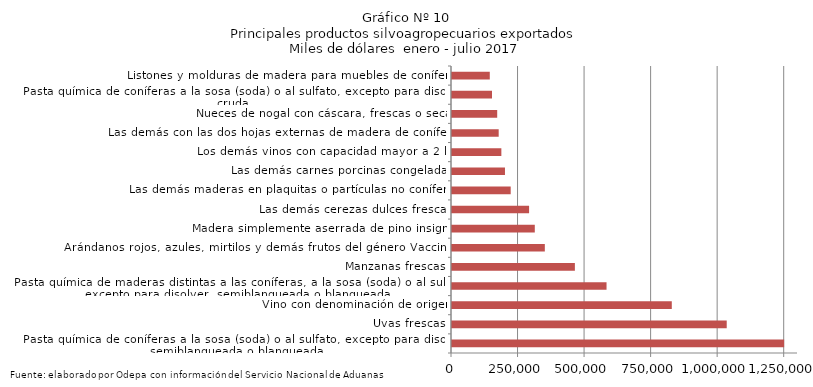
| Category | Series 0 |
|---|---|
| Pasta química de coníferas a la sosa (soda) o al sulfato, excepto para disolver, semiblanqueada o blanqueada | 1247924.648 |
| Uvas frescas | 1032195.708 |
| Vino con denominación de origen | 825824.941 |
| Pasta química de maderas distintas a las coníferas, a la sosa (soda) o al sulfato, excepto para disolver, semiblanqueada o blanqueada | 580644.315 |
| Manzanas frescas | 461706.92 |
| Arándanos rojos, azules, mirtilos y demás frutos del género Vaccinium | 348776.936 |
| Madera simplemente aserrada de pino insigne | 311083.835 |
| Las demás cerezas dulces frescas | 289633.785 |
| Las demás maderas en plaquitas o partículas no coníferas | 220536.906 |
| Las demás carnes porcinas congeladas | 199035.314 |
| Los demás vinos con capacidad mayor a 2 lts | 185440.667 |
| Las demás con las dos hojas externas de madera de coníferas | 175417.888 |
| Nueces de nogal con cáscara, frescas o secas | 169825.143 |
| Pasta química de coníferas a la sosa (soda) o al sulfato, excepto para disolver, cruda | 150295.124 |
| Listones y molduras de madera para muebles de coníferas | 141964.262 |